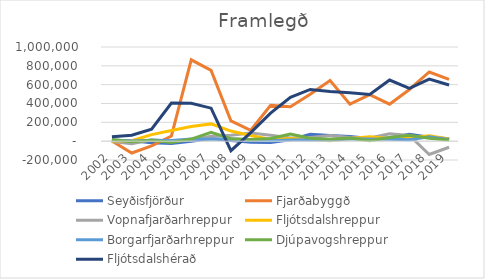
| Category | Seyðisfjörður | Fjarðabyggð | Vopnafjarðarhreppur | Fljótsdalshreppur | Borgarfjarðarhreppur | Djúpavogshreppur | Fljótsdalshérað |
|---|---|---|---|---|---|---|---|
| 2002.0 | 8494 | 2361 | -3259 | 1092 | 11641 | 17219 | 46735 |
| 2003.0 | 3156 | -125472 | -27231 | 5364 | 2820 | -5016 | 63848 |
| 2004.0 | -17778 | -49112 | 15124 | 69883 | 9481 | 8433 | 127295 |
| 2005.0 | -24512 | 54840 | -2484 | 113802 | 8067 | -14046 | 404402 |
| 2006.0 | -1430 | 863634 | 15623 | 155286 | 21797 | 22530 | 402295 |
| 2007.0 | 27118 | 751156 | 52607 | 183475 | 19693 | 94463 | 350505 |
| 2008.0 | 5835 | 216457 | 62403 | 107445 | 26530 | 25151 | -101562 |
| 2009.0 | -10223 | 115778 | 87476 | 60480 | 11299 | 18046 | 91264 |
| 2010.0 | -13408 | 379798 | 64056 | 17226 | 5503 | 28800 | 297617 |
| 2011.0 | 15993 | 365050 | 32496 | 28988 | 11145.832 | 74534.372 | 466103 |
| 2012.0 | 73171 | 498440 | 40110 | 18125 | 14596 | 31383 | 549175 |
| 2013.0 | 59271 | 645014 | 59005 | 4604 | 11018 | 20988 | 526657 |
| 2014.0 | 50803 | 392403 | 40252 | 27465 | 26107 | 34702 | 514056 |
| 2015.0 | 28867 | 494269 | 34242 | 47241 | 21907 | 4892 | 495500 |
| 2016.0 | 35451 | 392331 | 78391 | 28482 | 20286 | 39707 | 648771 |
| 2017.0 | 72382 | 548914 | 60652 | 35862 | 16281 | 62647 | 560313 |
| 2018.0 | 41194 | 734620 | -141465 | 56148 | 46589 | 31640 | 659608 |
| 2019.0 | 24592 | 655898 | -64878 | 22336 | 17052 | 12562 | 596009 |